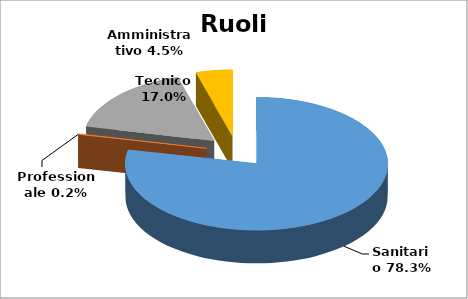
| Category | Series 0 |
|---|---|
| Sanitario | 0.783 |
| Professionale | 0.002 |
| Tecnico | 0.17 |
| Amministrativo | 0.045 |